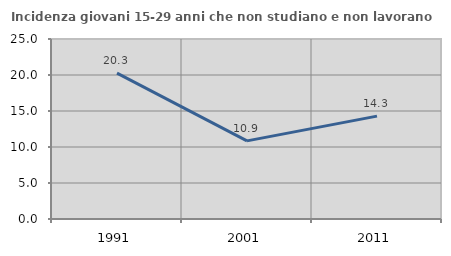
| Category | Incidenza giovani 15-29 anni che non studiano e non lavorano  |
|---|---|
| 1991.0 | 20.27 |
| 2001.0 | 10.853 |
| 2011.0 | 14.286 |